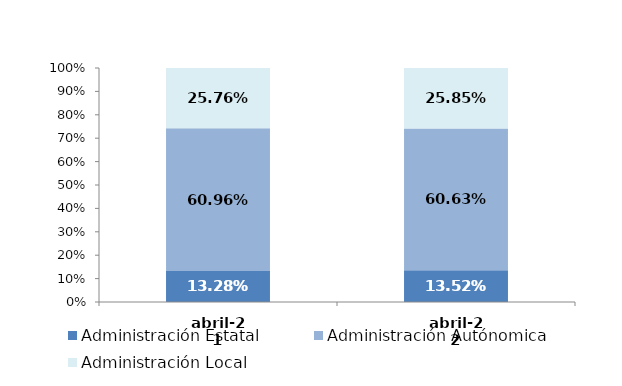
| Category | Administración Estatal | Administración Autónomica | Administración Local |
|---|---|---|---|
| 2021-04-01 | 0.133 | 0.61 | 0.258 |
| 2022-04-01 | 0.135 | 0.606 | 0.258 |